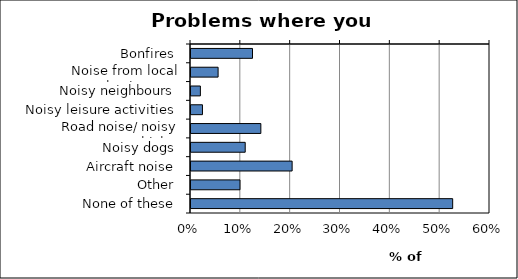
| Category | Series 0 |
|---|---|
| Bonfires | 0.123 |
| Noise from local businesses | 0.054 |
| Noisy neighbours | 0.019 |
| Noisy leisure activities | 0.023 |
| Road noise/ noisy vehicles | 0.14 |
| Noisy dogs | 0.109 |
| Aircraft noise | 0.203 |
| Other | 0.098 |
| None of these | 0.525 |